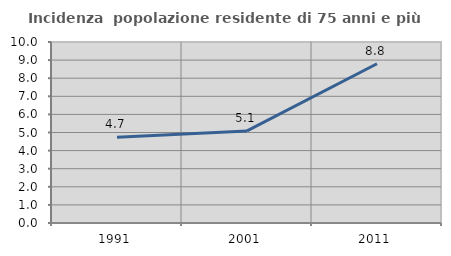
| Category | Incidenza  popolazione residente di 75 anni e più |
|---|---|
| 1991.0 | 4.742 |
| 2001.0 | 5.088 |
| 2011.0 | 8.799 |